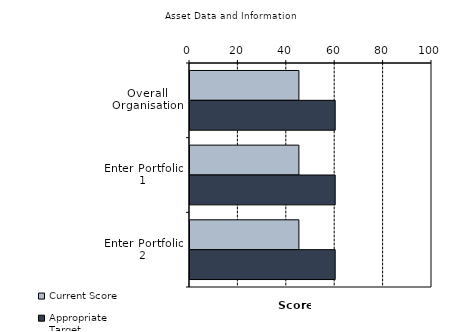
| Category | Current Score | Appropriate Target |
|---|---|---|
| Overall Organisation | 45 | 60 |
| Enter Portfolio 1 | 45 | 60 |
| Enter Portfolio 2 | 45 | 60 |